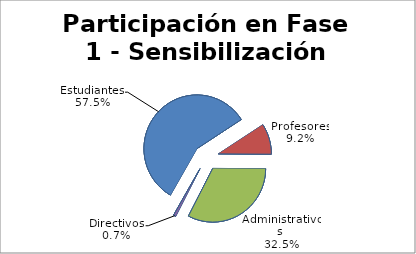
| Category | Series 0 |
|---|---|
| Estudiantes | 6234 |
| Profesores | 1000 |
| Administrativos  | 3523 |
| Directivos | 79 |